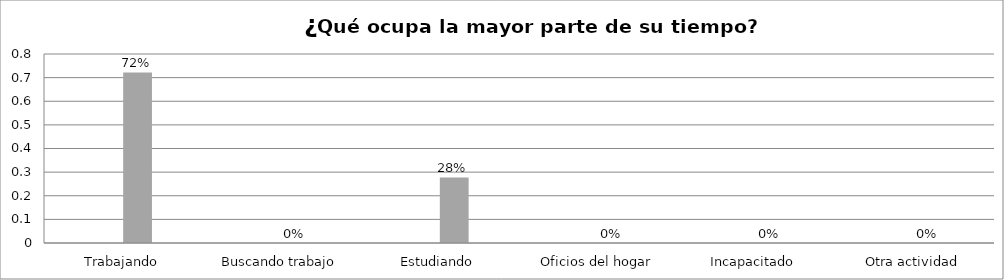
| Category | Series 0 | Series 1 | Series 2 | Series 3 |
|---|---|---|---|---|
| Trabajando |  |  | 0.722 |  |
| Buscando trabajo |  |  | 0 |  |
| Estudiando |  |  | 0.278 |  |
| Oficios del hogar |  |  | 0 |  |
| Incapacitado  |  |  | 0 |  |
| Otra actividad |  |  | 0 |  |